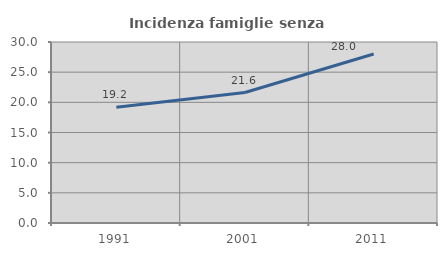
| Category | Incidenza famiglie senza nuclei |
|---|---|
| 1991.0 | 19.174 |
| 2001.0 | 21.622 |
| 2011.0 | 28.014 |